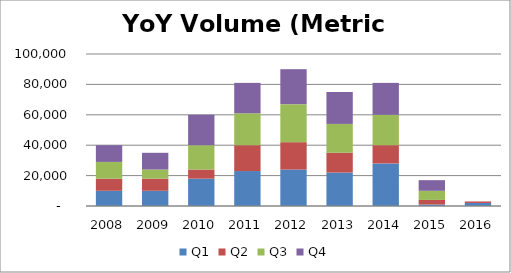
| Category | Q1 | Q2 | Q3 | Q4 |
|---|---|---|---|---|
| 2008.0 | 10000 | 8000 | 11000 | 11000 |
| 2009.0 | 10000 | 8000 | 6000 | 11000 |
| 2010.0 | 18000 | 6000 | 16000 | 20000 |
| 2011.0 | 23000 | 17000 | 21000 | 20000 |
| 2012.0 | 24000 | 18000 | 25000 | 23000 |
| 2013.0 | 22000 | 13000 | 19000 | 21000 |
| 2014.0 | 28000 | 12000 | 20000 | 21000 |
| 2015.0 | 1000 | 3000 | 6000 | 7000 |
| 2016.0 | 2000 | 1000 | 0 | 0 |